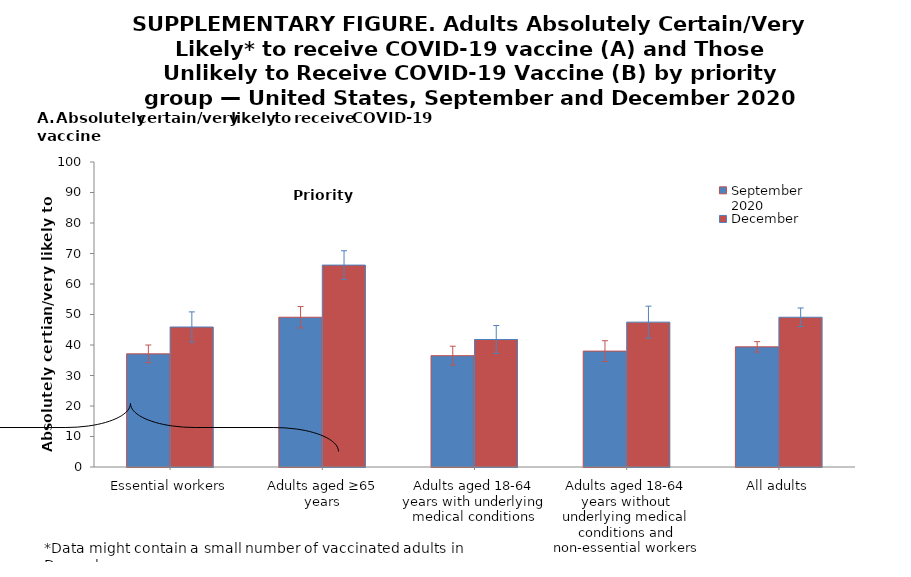
| Category | September 2020 | December 2020 |
|---|---|---|
| Essential workers | 37.1 | 45.9 |
| Adults aged ≥65 years | 49.1 | 66.2 |
| Adults aged 18-64 years with underlying medical conditions | 36.5 | 41.8 |
| Adults aged 18-64 years without underlying medical conditions and non-essential workers | 38 | 47.5 |
| All adults | 39.4 | 49.1 |